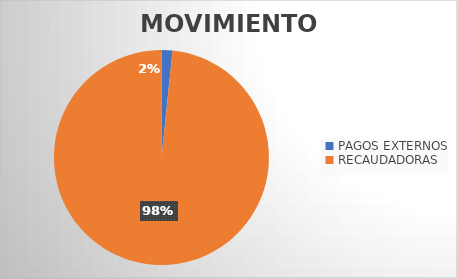
| Category | MOVIMIENTOS |
|---|---|
| PAGOS EXTERNOS | 408 |
| RECAUDADORAS | 24421 |